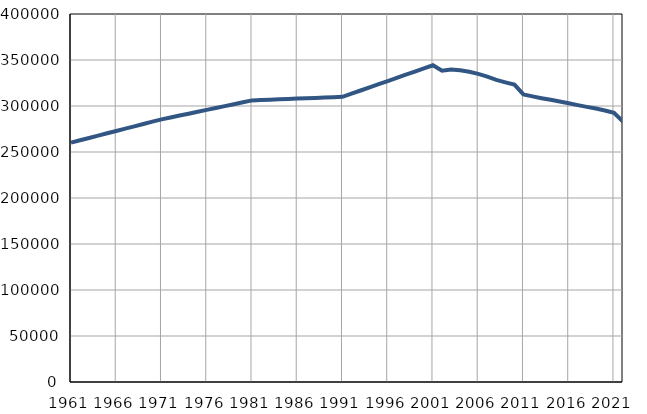
| Category | Број
становника |
|---|---|
| 1961.0 | 260226 |
| 1962.0 | 262751 |
| 1963.0 | 265276 |
| 1964.0 | 267800 |
| 1965.0 | 270325 |
| 1966.0 | 272850 |
| 1967.0 | 275375 |
| 1968.0 | 277900 |
| 1969.0 | 280424 |
| 1970.0 | 282949 |
| 1971.0 | 285474 |
| 1972.0 | 287535 |
| 1973.0 | 289596 |
| 1974.0 | 291657 |
| 1975.0 | 293718 |
| 1976.0 | 295780 |
| 1977.0 | 297841 |
| 1978.0 | 299902 |
| 1979.0 | 301963 |
| 1980.0 | 304024 |
| 1981.0 | 306085 |
| 1982.0 | 306475 |
| 1983.0 | 306864 |
| 1984.0 | 307254 |
| 1985.0 | 307643 |
| 1986.0 | 308033 |
| 1987.0 | 308423 |
| 1988.0 | 308812 |
| 1989.0 | 309201 |
| 1990.0 | 309591 |
| 1991.0 | 309981 |
| 1992.0 | 313411 |
| 1993.0 | 316840 |
| 1994.0 | 320270 |
| 1995.0 | 323700 |
| 1996.0 | 327129 |
| 1997.0 | 330559 |
| 1998.0 | 333988 |
| 1999.0 | 337418 |
| 2000.0 | 340848 |
| 2001.0 | 344277 |
| 2002.0 | 338285 |
| 2003.0 | 339700 |
| 2004.0 | 338833 |
| 2005.0 | 337216 |
| 2006.0 | 334989 |
| 2007.0 | 331866 |
| 2008.0 | 328397 |
| 2009.0 | 325734 |
| 2010.0 | 323197 |
| 2011.0 | 312530 |
| 2012.0 | 310418 |
| 2013.0 | 308512 |
| 2014.0 | 306717 |
| 2015.0 | 304889 |
| 2016.0 | 302929 |
| 2017.0 | 300988 |
| 2018.0 | 299060 |
| 2019.0 | 297197 |
| 2020.0 | 295132 |
| 2021.0 | 292579 |
| 2022.0 | 283032 |